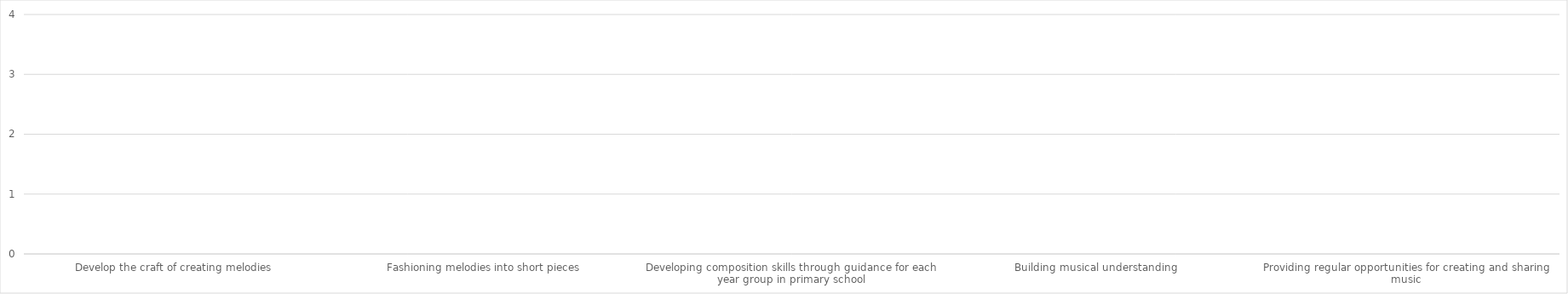
| Category | Series 0 |
|---|---|
| Develop the craft of creating melodies  | 0 |
| Fashioning melodies into short pieces | 0 |
| Developing composition skills through guidance for each year group in primary school | 0 |
| Building musical understanding  | 0 |
| Providing regular opportunities for creating and sharing music | 0 |